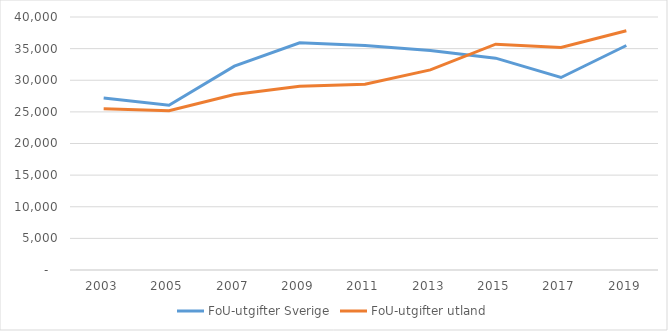
| Category | FoU-utgifter Sverige | FoU-utgifter utland |
|---|---|---|
| 2003.0 | 27194.015 | 25474.975 |
| 2005.0 | 26048.877 | 25183.195 |
| 2007.0 | 32227.31 | 27751.848 |
| 2009.0 | 35917.565 | 29053.172 |
| 2011.0 | 35511.455 | 29369.039 |
| 2013.0 | 34719.612 | 31634.859 |
| 2015.0 | 33492.915 | 35702.953 |
| 2017.0 | 30436.773 | 35183.089 |
| 2019.0 | 35490 | 37830 |